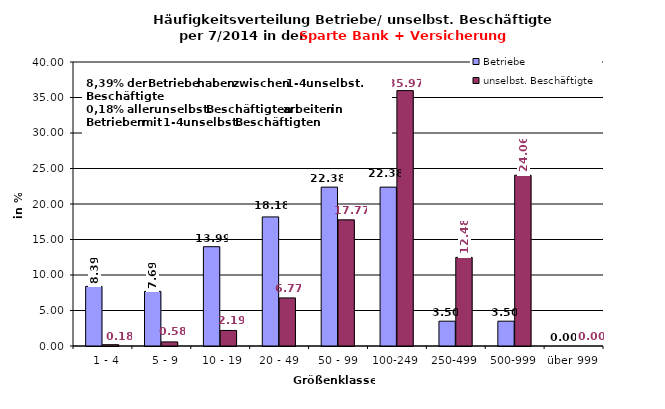
| Category | Betriebe | unselbst. Beschäftigte |
|---|---|---|
|   1 - 4 | 8.392 | 0.185 |
|   5 - 9 | 7.692 | 0.576 |
|  10 - 19 | 13.986 | 2.188 |
| 20 - 49 | 18.182 | 6.77 |
| 50 - 99 | 22.378 | 17.768 |
| 100-249 | 22.378 | 35.972 |
| 250-499 | 3.497 | 12.483 |
| 500-999 | 3.497 | 24.058 |
| über 999 | 0 | 0 |